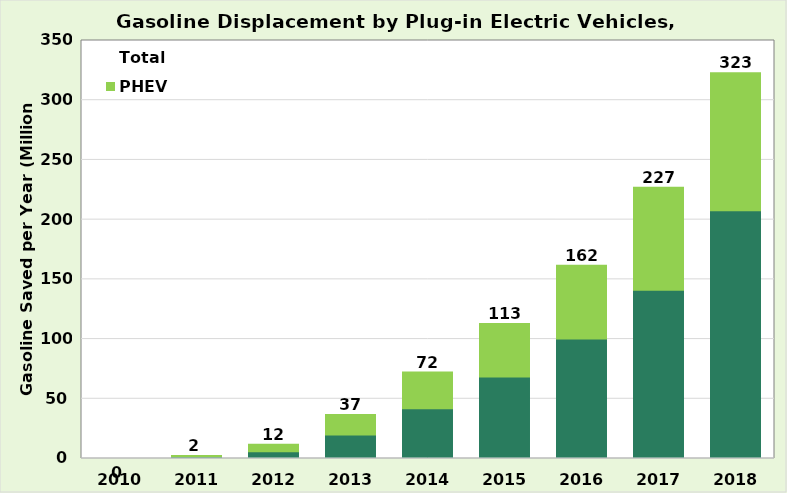
| Category | EV | PHEV | Total |
|---|---|---|---|
| 2010.0 | 0 | 0.004 | 0.005 |
| 2011.0 | 1.48 | 1.008 | 2.488 |
| 2012.0 | 5.64 | 6.277 | 11.917 |
| 2013.0 | 19.762 | 17.117 | 36.879 |
| 2014.0 | 41.755 | 30.671 | 72.426 |
| 2015.0 | 68.294 | 44.661 | 112.956 |
| 2016.0 | 99.977 | 61.926 | 161.904 |
| 2017.0 | 140.94 | 86.25 | 227.191 |
| 2018.0 | 207.495 | 115.485 | 322.98 |